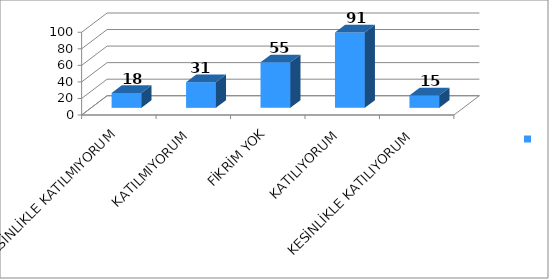
| Category | Series 0 |
|---|---|
| KESİNLİKLE KATILMIYORUM | 18 |
| KATILMIYORUM | 31 |
| FİKRİM YOK | 55 |
| KATILIYORUM | 91 |
| KESİNLİKLE KATILIYORUM | 15 |